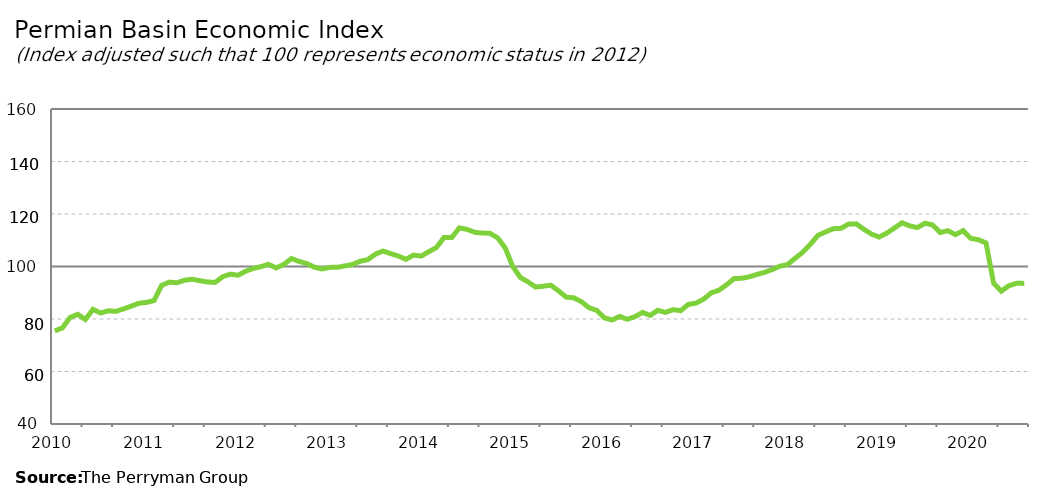
| Category | Permian Basin Composite |
|---|---|
| 2010-01-31 | 75.471 |
| 2010-02-28 | 76.627 |
| 2010-03-31 | 80.575 |
| 2010-04-30 | 81.787 |
| 2010-05-31 | 79.816 |
| 2010-06-30 | 83.665 |
| 2010-07-31 | 82.286 |
| 2010-08-31 | 83.131 |
| 2010-09-30 | 82.906 |
| 2010-10-31 | 83.851 |
| 2010-11-30 | 84.886 |
| 2010-12-31 | 85.995 |
| 2011-01-31 | 86.32 |
| 2011-02-28 | 87.021 |
| 2011-03-31 | 92.835 |
| 2011-04-30 | 94.049 |
| 2011-05-31 | 93.805 |
| 2011-06-30 | 94.772 |
| 2011-07-31 | 95.152 |
| 2011-08-31 | 94.587 |
| 2011-09-30 | 94.107 |
| 2011-10-31 | 93.944 |
| 2011-11-30 | 96.113 |
| 2011-12-31 | 97.087 |
| 2012-01-31 | 96.664 |
| 2012-02-29 | 98.201 |
| 2012-03-31 | 99.245 |
| 2012-04-30 | 99.945 |
| 2012-05-31 | 100.837 |
| 2012-06-30 | 99.463 |
| 2012-07-31 | 100.772 |
| 2012-08-31 | 103.038 |
| 2012-09-30 | 101.936 |
| 2012-10-31 | 101.139 |
| 2012-11-30 | 99.738 |
| 2012-12-31 | 99.056 |
| 2013-01-31 | 99.664 |
| 2013-02-28 | 99.691 |
| 2013-03-31 | 100.219 |
| 2013-04-30 | 100.777 |
| 2013-05-31 | 102.004 |
| 2013-06-30 | 102.611 |
| 2013-07-31 | 104.705 |
| 2013-08-31 | 105.903 |
| 2013-09-30 | 104.907 |
| 2013-10-31 | 104 |
| 2013-11-30 | 102.746 |
| 2013-12-31 | 104.331 |
| 2014-01-31 | 103.974 |
| 2014-02-28 | 105.633 |
| 2014-03-31 | 107.245 |
| 2014-04-30 | 111.084 |
| 2014-05-31 | 111.024 |
| 2014-06-30 | 114.713 |
| 2014-07-31 | 114.145 |
| 2014-08-31 | 113.025 |
| 2014-09-30 | 112.753 |
| 2014-10-31 | 112.651 |
| 2014-11-30 | 110.958 |
| 2014-12-31 | 107.096 |
| 2015-01-31 | 99.964 |
| 2015-02-28 | 95.803 |
| 2015-03-31 | 94.135 |
| 2015-04-30 | 92.154 |
| 2015-05-31 | 92.497 |
| 2015-06-30 | 92.857 |
| 2015-07-31 | 90.709 |
| 2015-08-31 | 88.332 |
| 2015-09-30 | 88.057 |
| 2015-10-31 | 86.574 |
| 2015-11-30 | 84.264 |
| 2015-12-31 | 83.291 |
| 2016-01-31 | 80.435 |
| 2016-02-29 | 79.624 |
| 2016-03-31 | 80.978 |
| 2016-04-30 | 79.889 |
| 2016-05-31 | 80.893 |
| 2016-06-30 | 82.501 |
| 2016-07-31 | 81.356 |
| 2016-08-31 | 83.308 |
| 2016-09-30 | 82.524 |
| 2016-10-31 | 83.559 |
| 2016-11-30 | 83.177 |
| 2016-12-31 | 85.585 |
| 2017-01-31 | 86.036 |
| 2017-02-28 | 87.568 |
| 2017-03-31 | 89.952 |
| 2017-04-30 | 90.954 |
| 2017-05-31 | 93.006 |
| 2017-06-30 | 95.414 |
| 2017-07-31 | 95.508 |
| 2017-08-31 | 96.074 |
| 2017-09-30 | 97.005 |
| 2017-10-31 | 97.77 |
| 2017-11-30 | 98.855 |
| 2017-12-31 | 100.101 |
| 2018-01-31 | 100.759 |
| 2018-02-28 | 103.133 |
| 2018-03-31 | 105.485 |
| 2018-04-30 | 108.504 |
| 2018-05-31 | 111.896 |
| 2018-06-30 | 113.205 |
| 2018-07-31 | 114.404 |
| 2018-08-31 | 114.543 |
| 2018-09-30 | 116.175 |
| 2018-10-31 | 116.243 |
| 2018-11-30 | 114.171 |
| 2018-12-31 | 112.36 |
| 2019-01-31 | 111.213 |
| 2019-02-28 | 112.703 |
| 2019-03-31 | 114.667 |
| 2019-04-30 | 116.643 |
| 2019-05-31 | 115.471 |
| 2019-06-30 | 114.827 |
| 2019-07-31 | 116.488 |
| 2019-08-31 | 115.831 |
| 2019-09-30 | 112.974 |
| 2019-10-31 | 113.626 |
| 2019-11-30 | 112.137 |
| 2019-12-31 | 113.662 |
| 2020-01-31 | 110.729 |
| 2020-02-29 | 110.208 |
| 2020-03-31 | 108.977 |
| 2020-04-30 | 93.633 |
| 2020-05-31 | 90.592 |
| 2020-06-30 | 92.683 |
| 2020-07-31 | 93.598 |
| 2020-08-31 | 93.565 |